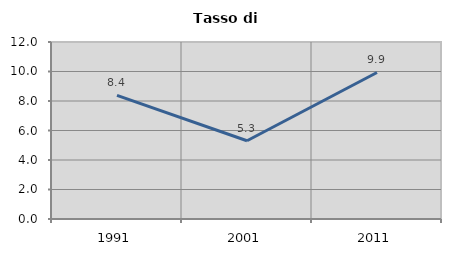
| Category | Tasso di disoccupazione   |
|---|---|
| 1991.0 | 8.38 |
| 2001.0 | 5.303 |
| 2011.0 | 9.935 |